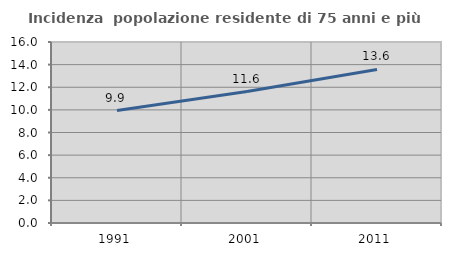
| Category | Incidenza  popolazione residente di 75 anni e più |
|---|---|
| 1991.0 | 9.944 |
| 2001.0 | 11.619 |
| 2011.0 | 13.578 |